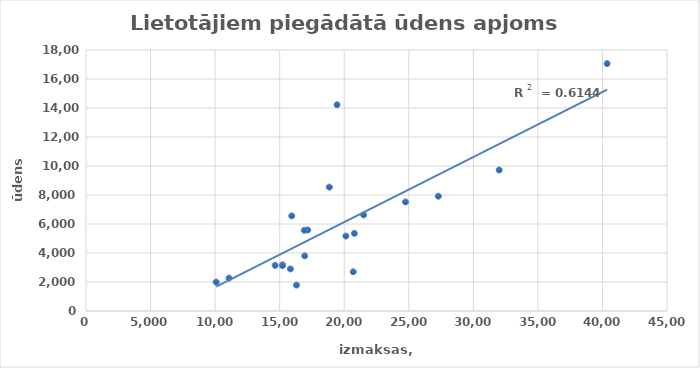
| Category | Lietotājiem piegādātā ūdens apjoms m3 |
|---|---|
| 20786.0 | 5352 |
| 14649.0 | 3144 |
| 40359.0 | 17064 |
| 17170.0 | 5587 |
| 20698.0 | 2705 |
| 32003.0 | 9724 |
| 15224.0 | 3185 |
| 11084.0 | 2269 |
| 10084.0 | 1992 |
| 19443.0 | 14225 |
| 15937.0 | 6559 |
| 18850.0 | 8544 |
| 20128.0 | 5170.002 |
| 15834.0 | 2903 |
| 27289.0 | 7917.548 |
| 21504.0 | 6628 |
| 16304.0 | 1788 |
| 24746.0 | 7522.243 |
| 15217.0 | 3129 |
| 16940.0 | 3803 |
| 16909.0 | 5565.794 |